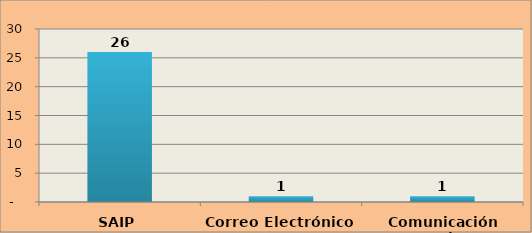
| Category | Cantidad |
|---|---|
| SAIP | 26 |
| Correo Electrónico | 1 |
| Comunicación Escrita | 1 |